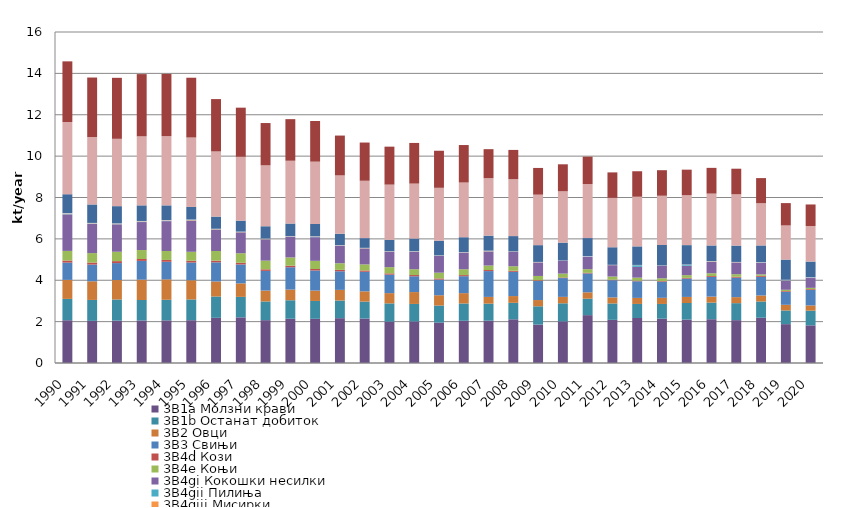
| Category | 3B1a Молзни крави | 3B1b Останат добиток | 3B2 Овци | 3B3 Свињи | 3B4d Кози | 3B4e Коњи | 3B4gi Кокошки несилки | 3B4gii Пилиња | 3B4giii Мисирки | 3B4giv Друга живина | 3Da1 Употреба на неоргански вештачки ѓубрива | 3Da2a Ѓубриво од животни | 3Da3 Урина депозитирана од тревопасни животни |
|---|---|---|---|---|---|---|---|---|---|---|---|---|---|
| 1990 | 2.067 | 1.032 | 0.919 | 0.835 | 0.101 | 0.464 | 1.765 | 0.015 | 0.021 | 0.031 | 0.907 | 3.491 | 2.932 |
| 1991 | 2.036 | 1.013 | 0.9 | 0.809 | 0.098 | 0.456 | 1.406 | 0.012 | 0.017 | 0.025 | 0.892 | 3.261 | 2.874 |
| 1992 | 2.047 | 1.023 | 0.941 | 0.82 | 0.095 | 0.452 | 1.324 | 0.011 | 0.016 | 0.023 | 0.83 | 3.255 | 2.949 |
| 1993 | 2.055 | 0.991 | 0.983 | 0.906 | 0.092 | 0.432 | 1.353 | 0.012 | 0.016 | 0.024 | 0.755 | 3.336 | 3.009 |
| 1994 | 2.062 | 0.994 | 0.986 | 0.85 | 0.089 | 0.433 | 1.443 | 0.012 | 0.017 | 0.025 | 0.706 | 3.347 | 3.01 |
| 1995 | 2.069 | 1.003 | 0.928 | 0.857 | 0.086 | 0.432 | 1.503 | 0.013 | 0.018 | 0.026 | 0.606 | 3.357 | 2.89 |
| 1996 | 2.184 | 1.032 | 0.726 | 0.925 | 0.083 | 0.465 | 1.035 | 0.009 | 0.012 | 0.018 | 0.588 | 3.149 | 2.531 |
| 1997 | 2.206 | 0.991 | 0.652 | 0.915 | 0.08 | 0.461 | 1.009 | 0.009 | 0.012 | 0.018 | 0.529 | 3.087 | 2.374 |
| 1998 | 2.071 | 0.904 | 0.526 | 0.951 | 0.077 | 0.419 | 1.029 | 0.009 | 0.012 | 0.018 | 0.594 | 2.945 | 2.044 |
| 1999 | 2.138 | 0.895 | 0.515 | 1.08 | 0.074 | 0.4 | 0.993 | 0.009 | 0.012 | 0.017 | 0.608 | 3.035 | 2.011 |
| 2000 | 2.136 | 0.863 | 0.5 | 0.972 | 0.071 | 0.395 | 1.144 | 0.01 | 0.014 | 0.02 | 0.593 | 3.014 | 1.966 |
| 2001 | 2.167 | 0.853 | 0.514 | 0.9 | 0.068 | 0.319 | 0.847 | 0.007 | 0.01 | 0.015 | 0.548 | 2.82 | 1.925 |
| 2002 | 2.149 | 0.821 | 0.494 | 0.946 | 0.065 | 0.292 | 0.77 | 0.007 | 0.009 | 0.014 | 0.469 | 2.774 | 1.847 |
| 2003 | 2 | 0.882 | 0.496 | 0.894 | 0.062 | 0.3 | 0.745 | 0.006 | 0.009 | 0.013 | 0.545 | 2.671 | 1.835 |
| 2004 | 2.009 | 0.846 | 0.573 | 0.764 | 0.06 | 0.283 | 0.84 | 0.007 | 0.01 | 0.015 | 0.61 | 2.656 | 1.965 |
| 2005 | 1.952 | 0.826 | 0.498 | 0.757 | 0.057 | 0.278 | 0.806 | 0.007 | 0.01 | 0.014 | 0.708 | 2.557 | 1.792 |
| 2006 | 2.04 | 0.838 | 0.5 | 0.819 | 0.054 | 0.284 | 0.796 | 0.007 | 0.01 | 0.014 | 0.72 | 2.645 | 1.812 |
| 2007 | 2.045 | 0.823 | 0.327 | 1.248 | 0.051 | 0.217 | 0.677 | 0.012 | 0.012 | 0.019 | 0.726 | 2.777 | 1.402 |
| 2008 | 2.113 | 0.797 | 0.327 | 1.171 | 0.053 | 0.217 | 0.695 | 0.001 | 0.009 | 0.011 | 0.74 | 2.752 | 1.414 |
| 2009 | 1.857 | 0.885 | 0.302 | 0.921 | 0.038 | 0.206 | 0.653 | 0.005 | 0.008 | 0.012 | 0.811 | 2.44 | 1.292 |
| 2010 | 2.012 | 0.873 | 0.311 | 0.908 | 0.03 | 0.187 | 0.624 | 0.004 | 0.003 | 0.005 | 0.861 | 2.483 | 1.304 |
| 2011 | 2.314 | 0.796 | 0.307 | 0.912 | 0.029 | 0.178 | 0.593 | 0.002 | 0.004 | 0.032 | 0.873 | 2.609 | 1.326 |
| 2012 | 2.085 | 0.793 | 0.293 | 0.831 | 0.025 | 0.152 | 0.549 | 0.005 | 0.006 | 0.008 | 0.848 | 2.389 | 1.229 |
| 2013 | 2.175 | 0.68 | 0.293 | 0.804 | 0.03 | 0.145 | 0.519 | 0.082 | 0.005 | 0.008 | 0.897 | 2.399 | 1.233 |
| 2014 | 2.142 | 0.712 | 0.296 | 0.778 | 0.033 | 0.136 | 0.603 | 0.004 | 0.005 | 0.008 | 0.988 | 2.38 | 1.235 |
| 2015 | 2.099 | 0.801 | 0.293 | 0.886 | 0.035 | 0.131 | 0.456 | 0.047 | 0.004 | 0.008 | 0.937 | 2.412 | 1.235 |
| 2016 | 2.117 | 0.803 | 0.289 | 0.954 | 0.041 | 0.135 | 0.546 | 0.015 | 0.015 | 0.015 | 0.753 | 2.506 | 1.244 |
| 2017 | 2.072 | 0.821 | 0.29 | 0.942 | 0.043 | 0.126 | 0.567 | 0.003 | 0.007 | 0.015 | 0.791 | 2.48 | 1.237 |
| 2018 | 2.188 | 0.786 | 0.291 | 0.901 | 0.047 | 0.07 | 0.556 | 0.004 | 0.01 | 0.021 | 0.811 | 2.041 | 1.214 |
| 2019 | 1.878 | 0.661 | 0.274 | 0.628 | 0.035 | 0.063 | 0.443 | 0.018 | 0.007 | 0.018 | 0.973 | 1.65 | 1.08 |
| 2020 | 1.82 | 0.71 | 0.252 | 0.748 | 0.038 | 0.064 | 0.474 | 0.015 | 0.008 | 0.019 | 0.755 | 1.719 | 1.04 |